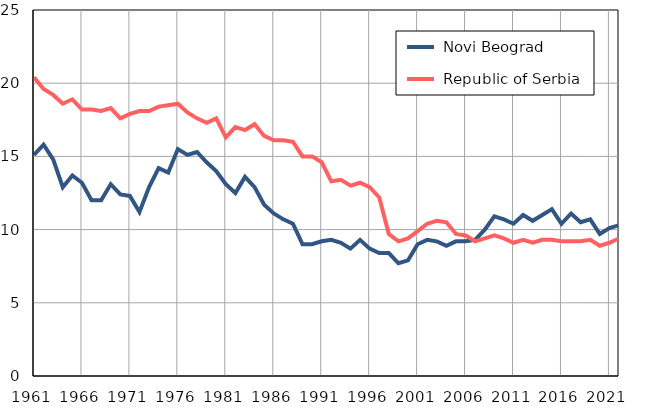
| Category |  Novi Beograd |  Republic of Serbia |
|---|---|---|
| 1961.0 | 15.1 | 20.4 |
| 1962.0 | 15.8 | 19.6 |
| 1963.0 | 14.8 | 19.2 |
| 1964.0 | 12.9 | 18.6 |
| 1965.0 | 13.7 | 18.9 |
| 1966.0 | 13.2 | 18.2 |
| 1967.0 | 12 | 18.2 |
| 1968.0 | 12 | 18.1 |
| 1969.0 | 13.1 | 18.3 |
| 1970.0 | 12.4 | 17.6 |
| 1971.0 | 12.3 | 17.9 |
| 1972.0 | 11.2 | 18.1 |
| 1973.0 | 12.9 | 18.1 |
| 1974.0 | 14.2 | 18.4 |
| 1975.0 | 13.9 | 18.5 |
| 1976.0 | 15.5 | 18.6 |
| 1977.0 | 15.1 | 18 |
| 1978.0 | 15.3 | 17.6 |
| 1979.0 | 14.6 | 17.3 |
| 1980.0 | 14 | 17.6 |
| 1981.0 | 13.1 | 16.3 |
| 1982.0 | 12.5 | 17 |
| 1983.0 | 13.6 | 16.8 |
| 1984.0 | 12.9 | 17.2 |
| 1985.0 | 11.7 | 16.4 |
| 1986.0 | 11.1 | 16.1 |
| 1987.0 | 10.7 | 16.1 |
| 1988.0 | 10.4 | 16 |
| 1989.0 | 9 | 15 |
| 1990.0 | 9 | 15 |
| 1991.0 | 9.2 | 14.6 |
| 1992.0 | 9.3 | 13.3 |
| 1993.0 | 9.1 | 13.4 |
| 1994.0 | 8.7 | 13 |
| 1995.0 | 9.3 | 13.2 |
| 1996.0 | 8.7 | 12.9 |
| 1997.0 | 8.4 | 12.2 |
| 1998.0 | 8.4 | 9.7 |
| 1999.0 | 7.7 | 9.2 |
| 2000.0 | 7.9 | 9.4 |
| 2001.0 | 9 | 9.9 |
| 2002.0 | 9.3 | 10.4 |
| 2003.0 | 9.2 | 10.6 |
| 2004.0 | 8.9 | 10.5 |
| 2005.0 | 9.2 | 9.7 |
| 2006.0 | 9.2 | 9.6 |
| 2007.0 | 9.3 | 9.2 |
| 2008.0 | 10 | 9.4 |
| 2009.0 | 10.9 | 9.6 |
| 2010.0 | 10.7 | 9.4 |
| 2011.0 | 10.4 | 9.1 |
| 2012.0 | 11 | 9.3 |
| 2013.0 | 10.6 | 9.1 |
| 2014.0 | 11 | 9.3 |
| 2015.0 | 11.4 | 9.3 |
| 2016.0 | 10.4 | 9.2 |
| 2017.0 | 11.1 | 9.2 |
| 2018.0 | 10.5 | 9.2 |
| 2019.0 | 10.7 | 9.3 |
| 2020.0 | 9.7 | 8.9 |
| 2021.0 | 10.1 | 9.1 |
| 2022.0 | 10.3 | 9.4 |